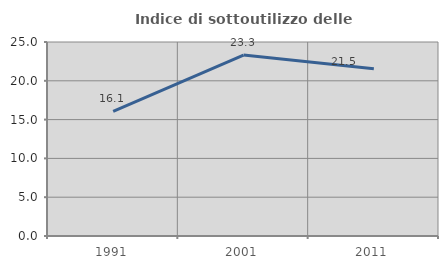
| Category | Indice di sottoutilizzo delle abitazioni  |
|---|---|
| 1991.0 | 16.074 |
| 2001.0 | 23.322 |
| 2011.0 | 21.549 |